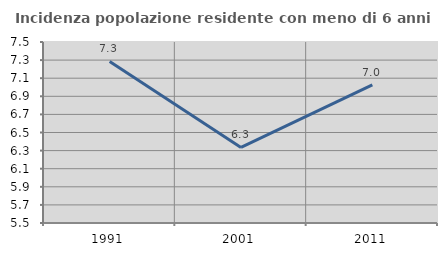
| Category | Incidenza popolazione residente con meno di 6 anni |
|---|---|
| 1991.0 | 7.285 |
| 2001.0 | 6.335 |
| 2011.0 | 7.027 |